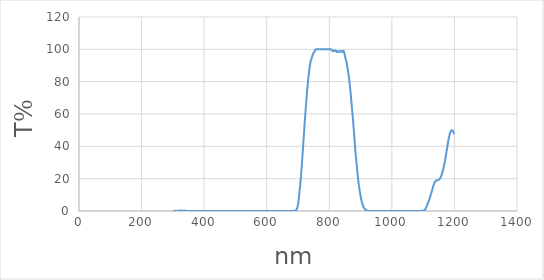
| Category | Series 0 |
|---|---|
| 1200.0 | 47.55 |
| 1199.0 | 47.82 |
| 1198.0 | 48.2 |
| 1197.0 | 48.63 |
| 1196.0 | 49.06 |
| 1195.0 | 49.43 |
| 1194.0 | 49.7 |
| 1193.0 | 49.86 |
| 1192.0 | 49.92 |
| 1191.0 | 49.93 |
| 1190.0 | 49.81 |
| 1189.0 | 49.59 |
| 1188.0 | 49.25 |
| 1187.0 | 48.82 |
| 1186.0 | 48.26 |
| 1185.0 | 47.58 |
| 1184.0 | 46.81 |
| 1183.0 | 45.95 |
| 1182.0 | 45 |
| 1181.0 | 43.97 |
| 1180.0 | 42.9 |
| 1179.0 | 41.79 |
| 1178.0 | 40.65 |
| 1177.0 | 39.48 |
| 1176.0 | 38.31 |
| 1175.0 | 37.14 |
| 1174.0 | 35.96 |
| 1173.0 | 34.79 |
| 1172.0 | 33.62 |
| 1171.0 | 32.47 |
| 1170.0 | 31.35 |
| 1169.0 | 30.29 |
| 1168.0 | 29.29 |
| 1167.0 | 28.34 |
| 1166.0 | 27.46 |
| 1165.0 | 26.62 |
| 1164.0 | 25.83 |
| 1163.0 | 25.06 |
| 1162.0 | 24.32 |
| 1161.0 | 23.62 |
| 1160.0 | 22.96 |
| 1159.0 | 22.35 |
| 1158.0 | 21.8 |
| 1157.0 | 21.32 |
| 1156.0 | 20.9 |
| 1155.0 | 20.54 |
| 1154.0 | 20.23 |
| 1153.0 | 19.96 |
| 1152.0 | 19.73 |
| 1151.0 | 19.53 |
| 1150.0 | 19.37 |
| 1149.0 | 19.24 |
| 1148.0 | 19.14 |
| 1147.0 | 19.07 |
| 1146.0 | 19.01 |
| 1145.0 | 18.97 |
| 1144.0 | 18.94 |
| 1143.0 | 18.9 |
| 1142.0 | 18.84 |
| 1141.0 | 18.74 |
| 1140.0 | 18.58 |
| 1139.0 | 18.36 |
| 1138.0 | 18.08 |
| 1137.0 | 17.73 |
| 1136.0 | 17.3 |
| 1135.0 | 16.82 |
| 1134.0 | 16.28 |
| 1133.0 | 15.7 |
| 1132.0 | 15.08 |
| 1131.0 | 14.41 |
| 1130.0 | 13.74 |
| 1129.0 | 13.07 |
| 1128.0 | 12.4 |
| 1127.0 | 11.74 |
| 1126.0 | 11.08 |
| 1125.0 | 10.44 |
| 1124.0 | 9.82 |
| 1123.0 | 9.19 |
| 1122.0 | 8.57 |
| 1121.0 | 7.95 |
| 1120.0 | 7.33 |
| 1119.0 | 6.74 |
| 1118.0 | 6.19 |
| 1117.0 | 5.65 |
| 1116.0 | 5.15 |
| 1115.0 | 4.66 |
| 1114.0 | 4.18 |
| 1113.0 | 3.69 |
| 1112.0 | 3.21 |
| 1111.0 | 2.75 |
| 1110.0 | 2.31 |
| 1109.0 | 1.91 |
| 1108.0 | 1.54 |
| 1107.0 | 1.23 |
| 1106.0 | 0.95 |
| 1105.0 | 0.72 |
| 1104.0 | 0.55 |
| 1103.0 | 0.41 |
| 1102.0 | 0.3 |
| 1101.0 | 0.23 |
| 1100.0 | 0.18 |
| 1099.0 | 0.16 |
| 1098.0 | 0.12 |
| 1097.0 | 0.11 |
| 1096.0 | 0.09 |
| 1095.0 | 0.08 |
| 1094.0 | 0.07 |
| 1093.0 | 0.06 |
| 1092.0 | 0.06 |
| 1091.0 | 0.05 |
| 1090.0 | 0.05 |
| 1089.0 | 0.04 |
| 1088.0 | 0.04 |
| 1087.0 | 0.02 |
| 1086.0 | 0.01 |
| 1085.0 | 0 |
| 1084.0 | 0.01 |
| 1083.0 | 0.02 |
| 1082.0 | 0.02 |
| 1081.0 | 0.03 |
| 1080.0 | 0.04 |
| 1079.0 | 0.05 |
| 1078.0 | 0.04 |
| 1077.0 | 0.03 |
| 1076.0 | 0.01 |
| 1075.0 | 0 |
| 1074.0 | 0 |
| 1073.0 | 0 |
| 1072.0 | 0 |
| 1071.0 | 0 |
| 1070.0 | 0 |
| 1069.0 | 0 |
| 1068.0 | 0 |
| 1067.0 | 0 |
| 1066.0 | 0.01 |
| 1065.0 | 0.01 |
| 1064.0 | 0 |
| 1063.0 | 0 |
| 1062.0 | 0 |
| 1061.0 | 0.01 |
| 1060.0 | 0.01 |
| 1059.0 | 0.01 |
| 1058.0 | 0.01 |
| 1057.0 | 0.02 |
| 1056.0 | 0.03 |
| 1055.0 | 0.03 |
| 1054.0 | 0.02 |
| 1053.0 | 0 |
| 1052.0 | 0.01 |
| 1051.0 | 0.01 |
| 1050.0 | 0.03 |
| 1049.0 | 0.01 |
| 1048.0 | 0 |
| 1047.0 | 0.02 |
| 1046.0 | 0.03 |
| 1045.0 | 0.04 |
| 1044.0 | 0.03 |
| 1043.0 | 0.02 |
| 1042.0 | 0 |
| 1041.0 | 0.01 |
| 1040.0 | 0.03 |
| 1039.0 | 0.03 |
| 1038.0 | 0.03 |
| 1037.0 | 0.02 |
| 1036.0 | 0.02 |
| 1035.0 | 0 |
| 1034.0 | 0 |
| 1033.0 | 0.01 |
| 1032.0 | 0.01 |
| 1031.0 | 0.02 |
| 1030.0 | 0.01 |
| 1029.0 | 0.01 |
| 1028.0 | 0.01 |
| 1027.0 | 0.01 |
| 1026.0 | 0.02 |
| 1025.0 | 0.03 |
| 1024.0 | 0.03 |
| 1023.0 | 0.03 |
| 1022.0 | 0.03 |
| 1021.0 | 0.02 |
| 1020.0 | 0.01 |
| 1019.0 | 0.01 |
| 1018.0 | 0 |
| 1017.0 | 0 |
| 1016.0 | 0.01 |
| 1015.0 | 0.01 |
| 1014.0 | 0.02 |
| 1013.0 | 0.04 |
| 1012.0 | 0.04 |
| 1011.0 | 0.05 |
| 1010.0 | 0.04 |
| 1009.0 | 0.02 |
| 1008.0 | 0 |
| 1007.0 | 0.01 |
| 1006.0 | 0 |
| 1005.0 | 0.01 |
| 1004.0 | 0.02 |
| 1003.0 | 0.04 |
| 1002.0 | 0.04 |
| 1001.0 | 0.03 |
| 1000.0 | 0.02 |
| 999.0 | 0.01 |
| 998.0 | 0.01 |
| 997.0 | 0 |
| 996.0 | 0.01 |
| 995.0 | 0.01 |
| 994.0 | 0.02 |
| 993.0 | 0.02 |
| 992.0 | 0.03 |
| 991.0 | 0.02 |
| 990.0 | 0.01 |
| 989.0 | 0.01 |
| 988.0 | 0.01 |
| 987.0 | 0 |
| 986.0 | 0 |
| 985.0 | 0 |
| 984.0 | 0 |
| 983.0 | 0.01 |
| 982.0 | 0.02 |
| 981.0 | 0.01 |
| 980.0 | 0.01 |
| 979.0 | 0.01 |
| 978.0 | 0.01 |
| 977.0 | 0 |
| 976.0 | 0.01 |
| 975.0 | 0 |
| 974.0 | 0.01 |
| 973.0 | 0.02 |
| 972.0 | 0.03 |
| 971.0 | 0.03 |
| 970.0 | 0.03 |
| 969.0 | 0.01 |
| 968.0 | 0.01 |
| 967.0 | 0.02 |
| 966.0 | 0.04 |
| 965.0 | 0.03 |
| 964.0 | 0.01 |
| 963.0 | 0 |
| 962.0 | 0.02 |
| 961.0 | 0.04 |
| 960.0 | 0.05 |
| 959.0 | 0.05 |
| 958.0 | 0.04 |
| 957.0 | 0.01 |
| 956.0 | 0.01 |
| 955.0 | 0.02 |
| 954.0 | 0.03 |
| 953.0 | 0.03 |
| 952.0 | 0.04 |
| 951.0 | 0.02 |
| 950.0 | 0.02 |
| 949.0 | 0.03 |
| 948.0 | 0.02 |
| 947.0 | 0.04 |
| 946.0 | 0.02 |
| 945.0 | 0.01 |
| 944.0 | 0.02 |
| 943.0 | 0.04 |
| 942.0 | 0.04 |
| 941.0 | 0.04 |
| 940.0 | 0.05 |
| 939.0 | 0.04 |
| 938.0 | 0.03 |
| 937.0 | 0.01 |
| 936.0 | 0.01 |
| 935.0 | 0 |
| 934.0 | 0.01 |
| 933.0 | 0.04 |
| 932.0 | 0.05 |
| 931.0 | 0.04 |
| 930.0 | 0.03 |
| 929.0 | 0.02 |
| 928.0 | 0.02 |
| 927.0 | 0 |
| 926.0 | 0 |
| 925.0 | 0.02 |
| 924.0 | 0.03 |
| 923.0 | 0.05 |
| 922.0 | 0.11 |
| 921.0 | 0.19 |
| 920.0 | 0.28 |
| 919.0 | 0.35 |
| 918.0 | 0.47 |
| 917.0 | 0.61 |
| 916.0 | 0.78 |
| 915.0 | 0.97 |
| 914.0 | 1.16 |
| 913.0 | 1.43 |
| 912.0 | 1.67 |
| 911.0 | 1.97 |
| 910.0 | 2.26 |
| 909.0 | 2.64 |
| 908.0 | 3.1 |
| 907.0 | 3.64 |
| 906.0 | 4.27 |
| 905.0 | 4.89 |
| 904.0 | 5.6 |
| 903.0 | 6.39 |
| 902.0 | 7.3 |
| 901.0 | 8.26 |
| 900.0 | 9.29 |
| 899.0 | 10.43 |
| 898.0 | 11.59 |
| 897.0 | 12.8 |
| 896.0 | 14.05 |
| 895.0 | 15.34 |
| 894.0 | 16.73 |
| 893.0 | 18.23 |
| 892.0 | 19.93 |
| 891.0 | 21.75 |
| 890.0 | 23.65 |
| 889.0 | 25.61 |
| 888.0 | 27.62 |
| 887.0 | 29.65 |
| 886.0 | 31.67 |
| 885.0 | 33.78 |
| 884.0 | 36.02 |
| 883.0 | 38.33 |
| 882.0 | 40.84 |
| 881.0 | 43.41 |
| 880.0 | 46 |
| 879.0 | 48.6 |
| 878.0 | 51.07 |
| 877.0 | 53.48 |
| 876.0 | 55.77 |
| 875.0 | 58.03 |
| 874.0 | 60.3 |
| 873.0 | 62.55 |
| 872.0 | 64.71 |
| 871.0 | 66.89 |
| 870.0 | 69.01 |
| 869.0 | 71.14 |
| 868.0 | 73.24 |
| 867.0 | 75.24 |
| 866.0 | 77.23 |
| 865.0 | 79.11 |
| 864.0 | 80.84 |
| 863.0 | 82.51 |
| 862.0 | 83.9 |
| 861.0 | 85.25 |
| 860.0 | 86.55 |
| 859.0 | 87.75 |
| 858.0 | 88.93 |
| 857.0 | 90.07 |
| 856.0 | 91.23 |
| 855.0 | 92.11 |
| 854.0 | 92.84 |
| 853.0 | 93.4 |
| 852.0 | 94.27 |
| 851.0 | 95.17 |
| 850.0 | 96.04 |
| 849.0 | 96.93 |
| 848.0 | 97.77 |
| 847.0 | 98.53 |
| 846.0 | 99.01 |
| 845.0 | 99.16 |
| 844.0 | 98.74 |
| 843.0 | 98.33 |
| 842.0 | 98.46 |
| 841.0 | 98.38 |
| 840.0 | 98.57 |
| 839.0 | 98.74 |
| 838.0 | 98.94 |
| 837.0 | 98.95 |
| 836.0 | 98.76 |
| 835.0 | 98.69 |
| 834.0 | 98.57 |
| 833.0 | 98.37 |
| 832.0 | 98.59 |
| 831.0 | 98.81 |
| 830.0 | 98.77 |
| 829.0 | 98.75 |
| 828.0 | 98.69 |
| 827.0 | 98.31 |
| 826.0 | 98.19 |
| 825.0 | 98.47 |
| 824.0 | 98.85 |
| 823.0 | 99 |
| 822.0 | 98.87 |
| 821.0 | 99.04 |
| 820.0 | 99.15 |
| 819.0 | 99.02 |
| 818.0 | 99.23 |
| 817.0 | 99.1 |
| 816.0 | 99.15 |
| 815.0 | 99.28 |
| 814.0 | 99.21 |
| 813.0 | 99.14 |
| 812.0 | 98.84 |
| 811.0 | 98.81 |
| 810.0 | 99.06 |
| 809.0 | 99.32 |
| 808.0 | 99.44 |
| 807.0 | 99.72 |
| 806.0 | 99.93 |
| 805.0 | 99.96 |
| 804.0 | 100 |
| 803.0 | 100 |
| 802.0 | 100 |
| 801.0 | 100 |
| 800.0 | 100 |
| 799.0 | 100 |
| 798.0 | 100 |
| 797.0 | 100 |
| 796.0 | 100 |
| 795.0 | 100 |
| 794.0 | 100 |
| 793.0 | 100 |
| 792.0 | 100 |
| 791.0 | 100 |
| 790.0 | 100 |
| 789.0 | 100 |
| 788.0 | 100 |
| 787.0 | 100 |
| 786.0 | 100 |
| 785.0 | 100 |
| 784.0 | 100 |
| 783.0 | 100 |
| 782.0 | 100 |
| 781.0 | 100 |
| 780.0 | 100 |
| 779.0 | 100 |
| 778.0 | 100 |
| 777.0 | 100 |
| 776.0 | 100 |
| 775.0 | 100 |
| 774.0 | 100 |
| 773.0 | 100 |
| 772.0 | 100 |
| 771.0 | 100 |
| 770.0 | 100 |
| 769.0 | 100 |
| 768.0 | 100 |
| 767.0 | 100 |
| 766.0 | 100 |
| 765.0 | 100 |
| 764.0 | 100 |
| 763.0 | 100 |
| 762.0 | 100 |
| 761.0 | 100 |
| 760.0 | 100 |
| 759.0 | 100 |
| 758.0 | 100 |
| 757.0 | 100 |
| 756.0 | 99.78 |
| 755.0 | 99.46 |
| 754.0 | 99.02 |
| 753.0 | 98.52 |
| 752.0 | 98.36 |
| 751.0 | 98.07 |
| 750.0 | 97.78 |
| 749.0 | 97.65 |
| 748.0 | 97.21 |
| 747.0 | 96.62 |
| 746.0 | 95.99 |
| 745.0 | 95.42 |
| 744.0 | 94.7 |
| 743.0 | 94.08 |
| 742.0 | 93.43 |
| 741.0 | 92.9 |
| 740.0 | 92.07 |
| 739.0 | 90.97 |
| 738.0 | 89.85 |
| 737.0 | 88.58 |
| 736.0 | 87.14 |
| 735.0 | 85.65 |
| 734.0 | 83.96 |
| 733.0 | 82.19 |
| 732.0 | 80.26 |
| 731.0 | 78.32 |
| 730.0 | 76.19 |
| 729.0 | 73.95 |
| 728.0 | 71.63 |
| 727.0 | 69.31 |
| 726.0 | 66.81 |
| 725.0 | 64.26 |
| 724.0 | 61.57 |
| 723.0 | 58.84 |
| 722.0 | 56.07 |
| 721.0 | 53.36 |
| 720.0 | 50.55 |
| 719.0 | 47.72 |
| 718.0 | 44.93 |
| 717.0 | 42.15 |
| 716.0 | 39.3 |
| 715.0 | 36.39 |
| 714.0 | 33.49 |
| 713.0 | 30.6 |
| 712.0 | 27.83 |
| 711.0 | 25.23 |
| 710.0 | 22.74 |
| 709.0 | 20.41 |
| 708.0 | 18.21 |
| 707.0 | 16.15 |
| 706.0 | 14.14 |
| 705.0 | 12.15 |
| 704.0 | 10.27 |
| 703.0 | 8.52 |
| 702.0 | 6.89 |
| 701.0 | 5.42 |
| 700.0 | 4.16 |
| 699.0 | 3.1 |
| 698.0 | 2.27 |
| 697.0 | 1.63 |
| 696.0 | 1.13 |
| 695.0 | 0.8 |
| 694.0 | 0.58 |
| 693.0 | 0.42 |
| 692.0 | 0.32 |
| 691.0 | 0.24 |
| 690.0 | 0.2 |
| 689.0 | 0.15 |
| 688.0 | 0.12 |
| 687.0 | 0.1 |
| 686.0 | 0.08 |
| 685.0 | 0.07 |
| 684.0 | 0.06 |
| 683.0 | 0.05 |
| 682.0 | 0.04 |
| 681.0 | 0.04 |
| 680.0 | 0.03 |
| 679.0 | 0.03 |
| 678.0 | 0.03 |
| 677.0 | 0.03 |
| 676.0 | 0.03 |
| 675.0 | 0.03 |
| 674.0 | 0.03 |
| 673.0 | 0.02 |
| 672.0 | 0.02 |
| 671.0 | 0.02 |
| 670.0 | 0.02 |
| 669.0 | 0.01 |
| 668.0 | 0.01 |
| 667.0 | 0.01 |
| 666.0 | 0.01 |
| 665.0 | 0.02 |
| 664.0 | 0.02 |
| 663.0 | 0.02 |
| 662.0 | 0.02 |
| 661.0 | 0.03 |
| 660.0 | 0.03 |
| 659.0 | 0.03 |
| 658.0 | 0.03 |
| 657.0 | 0.03 |
| 656.0 | 0.03 |
| 655.0 | 0.03 |
| 654.0 | 0.02 |
| 653.0 | 0.02 |
| 652.0 | 0.02 |
| 651.0 | 0.01 |
| 650.0 | 0.01 |
| 649.0 | 0.01 |
| 648.0 | 0.01 |
| 647.0 | 0.01 |
| 646.0 | 0.01 |
| 645.0 | 0.02 |
| 644.0 | 0.02 |
| 643.0 | 0.02 |
| 642.0 | 0.02 |
| 641.0 | 0.02 |
| 640.0 | 0.01 |
| 639.0 | 0.01 |
| 638.0 | 0.01 |
| 637.0 | 0.01 |
| 636.0 | 0.01 |
| 635.0 | 0.01 |
| 634.0 | 0.01 |
| 633.0 | 0.01 |
| 632.0 | 0.01 |
| 631.0 | 0.01 |
| 630.0 | 0.01 |
| 629.0 | 0.01 |
| 628.0 | 0.01 |
| 627.0 | 0.01 |
| 626.0 | 0.01 |
| 625.0 | 0.01 |
| 624.0 | 0.01 |
| 623.0 | 0.01 |
| 622.0 | 0.02 |
| 621.0 | 0.02 |
| 620.0 | 0.01 |
| 619.0 | 0.01 |
| 618.0 | 0.01 |
| 617.0 | 0.01 |
| 616.0 | 0.01 |
| 615.0 | 0.01 |
| 614.0 | 0.01 |
| 613.0 | 0.01 |
| 612.0 | 0.01 |
| 611.0 | 0.02 |
| 610.0 | 0.02 |
| 609.0 | 0.02 |
| 608.0 | 0.02 |
| 607.0 | 0.02 |
| 606.0 | 0.02 |
| 605.0 | 0.02 |
| 604.0 | 0.02 |
| 603.0 | 0.02 |
| 602.0 | 0.02 |
| 601.0 | 0.02 |
| 600.0 | 0.02 |
| 599.0 | 0.01 |
| 598.0 | 0.01 |
| 597.0 | 0.01 |
| 596.0 | 0.01 |
| 595.0 | 0.01 |
| 594.0 | 0.01 |
| 593.0 | 0.01 |
| 592.0 | 0.01 |
| 591.0 | 0.01 |
| 590.0 | 0.01 |
| 589.0 | 0.01 |
| 588.0 | 0.01 |
| 587.0 | 0.01 |
| 586.0 | 0.01 |
| 585.0 | 0.01 |
| 584.0 | 0.01 |
| 583.0 | 0.01 |
| 582.0 | 0.01 |
| 581.0 | 0.01 |
| 580.0 | 0.02 |
| 579.0 | 0.01 |
| 578.0 | 0.01 |
| 577.0 | 0.01 |
| 576.0 | 0.02 |
| 575.0 | 0.02 |
| 574.0 | 0.02 |
| 573.0 | 0.02 |
| 572.0 | 0.02 |
| 571.0 | 0.02 |
| 570.0 | 0.02 |
| 569.0 | 0.01 |
| 568.0 | 0.01 |
| 567.0 | 0.01 |
| 566.0 | 0.01 |
| 565.0 | 0.01 |
| 564.0 | 0.01 |
| 563.0 | 0.01 |
| 562.0 | 0.01 |
| 561.0 | 0.01 |
| 560.0 | 0.01 |
| 559.0 | 0.01 |
| 558.0 | 0.01 |
| 557.0 | 0.01 |
| 556.0 | 0.01 |
| 555.0 | 0.01 |
| 554.0 | 0.01 |
| 553.0 | 0.01 |
| 552.0 | 0.01 |
| 551.0 | 0.01 |
| 550.0 | 0.01 |
| 549.0 | 0.01 |
| 548.0 | 0.01 |
| 547.0 | 0.01 |
| 546.0 | 0.01 |
| 545.0 | 0.01 |
| 544.0 | 0.01 |
| 543.0 | 0.01 |
| 542.0 | 0.01 |
| 541.0 | 0.01 |
| 540.0 | 0.01 |
| 539.0 | 0.01 |
| 538.0 | 0.01 |
| 537.0 | 0.01 |
| 536.0 | 0.01 |
| 535.0 | 0.01 |
| 534.0 | 0.01 |
| 533.0 | 0.01 |
| 532.0 | 0.01 |
| 531.0 | 0.01 |
| 530.0 | 0.02 |
| 529.0 | 0.02 |
| 528.0 | 0.02 |
| 527.0 | 0.02 |
| 526.0 | 0.01 |
| 525.0 | 0.01 |
| 524.0 | 0.01 |
| 523.0 | 0.01 |
| 522.0 | 0.01 |
| 521.0 | 0.02 |
| 520.0 | 0.02 |
| 519.0 | 0.02 |
| 518.0 | 0.02 |
| 517.0 | 0.02 |
| 516.0 | 0.01 |
| 515.0 | 0.01 |
| 514.0 | 0.02 |
| 513.0 | 0.01 |
| 512.0 | 0.01 |
| 511.0 | 0.01 |
| 510.0 | 0.01 |
| 509.0 | 0.01 |
| 508.0 | 0.01 |
| 507.0 | 0.01 |
| 506.0 | 0.01 |
| 505.0 | 0.01 |
| 504.0 | 0.01 |
| 503.0 | 0.01 |
| 502.0 | 0.01 |
| 501.0 | 0.01 |
| 500.0 | 0.01 |
| 499.0 | 0.01 |
| 498.0 | 0.01 |
| 497.0 | 0.01 |
| 496.0 | 0.01 |
| 495.0 | 0.01 |
| 494.0 | 0.01 |
| 493.0 | 0.02 |
| 492.0 | 0.01 |
| 491.0 | 0.01 |
| 490.0 | 0.01 |
| 489.0 | 0.01 |
| 488.0 | 0.01 |
| 487.0 | 0.01 |
| 486.0 | 0.01 |
| 485.0 | 0.01 |
| 484.0 | 0.01 |
| 483.0 | 0.01 |
| 482.0 | 0.01 |
| 481.0 | 0.01 |
| 480.0 | 0.01 |
| 479.0 | 0.01 |
| 478.0 | 0.01 |
| 477.0 | 0.01 |
| 476.0 | 0.02 |
| 475.0 | 0.02 |
| 474.0 | 0.02 |
| 473.0 | 0.02 |
| 472.0 | 0.03 |
| 471.0 | 0.03 |
| 470.0 | 0.03 |
| 469.0 | 0.03 |
| 468.0 | 0.03 |
| 467.0 | 0.03 |
| 466.0 | 0.03 |
| 465.0 | 0.02 |
| 464.0 | 0.02 |
| 463.0 | 0.02 |
| 462.0 | 0.02 |
| 461.0 | 0.02 |
| 460.0 | 0.02 |
| 459.0 | 0.02 |
| 458.0 | 0.01 |
| 457.0 | 0.01 |
| 456.0 | 0.01 |
| 455.0 | 0.02 |
| 454.0 | 0.02 |
| 453.0 | 0.02 |
| 452.0 | 0.02 |
| 451.0 | 0.02 |
| 450.0 | 0.01 |
| 449.0 | 0.01 |
| 448.0 | 0.01 |
| 447.0 | 0 |
| 446.0 | 0 |
| 445.0 | 0.01 |
| 444.0 | 0.01 |
| 443.0 | 0.01 |
| 442.0 | 0.02 |
| 441.0 | 0.02 |
| 440.0 | 0.02 |
| 439.0 | 0.02 |
| 438.0 | 0.02 |
| 437.0 | 0.02 |
| 436.0 | 0.01 |
| 435.0 | 0.01 |
| 434.0 | 0.01 |
| 433.0 | 0.01 |
| 432.0 | 0.01 |
| 431.0 | 0.01 |
| 430.0 | 0.01 |
| 429.0 | 0.01 |
| 428.0 | 0.01 |
| 427.0 | 0 |
| 426.0 | 0 |
| 425.0 | 0.01 |
| 424.0 | 0.01 |
| 423.0 | 0.01 |
| 422.0 | 0.01 |
| 421.0 | 0.01 |
| 420.0 | 0.01 |
| 419.0 | 0.01 |
| 418.0 | 0.01 |
| 417.0 | 0.01 |
| 416.0 | 0.01 |
| 415.0 | 0.01 |
| 414.0 | 0.01 |
| 413.0 | 0.01 |
| 412.0 | 0.02 |
| 411.0 | 0.02 |
| 410.0 | 0.02 |
| 409.0 | 0.02 |
| 408.0 | 0.02 |
| 407.0 | 0.02 |
| 406.0 | 0.03 |
| 405.0 | 0.03 |
| 404.0 | 0.03 |
| 403.0 | 0.04 |
| 402.0 | 0.04 |
| 401.0 | 0.04 |
| 400.0 | 0.03 |
| 399.0 | 0.03 |
| 398.0 | 0.02 |
| 397.0 | 0.01 |
| 396.0 | 0.01 |
| 395.0 | 0.02 |
| 394.0 | 0.02 |
| 393.0 | 0.03 |
| 392.0 | 0.03 |
| 391.0 | 0.04 |
| 390.0 | 0.03 |
| 389.0 | 0.03 |
| 388.0 | 0.02 |
| 387.0 | 0.01 |
| 386.0 | 0.01 |
| 385.0 | 0.02 |
| 384.0 | 0.02 |
| 383.0 | 0.02 |
| 382.0 | 0.02 |
| 381.0 | 0.04 |
| 380.0 | 0.04 |
| 379.0 | 0.04 |
| 378.0 | 0.04 |
| 377.0 | 0.04 |
| 376.0 | 0.04 |
| 375.0 | 0.03 |
| 374.0 | 0.03 |
| 373.0 | 0.04 |
| 372.0 | 0.04 |
| 371.0 | 0.04 |
| 370.0 | 0.04 |
| 369.0 | 0.04 |
| 368.0 | 0.03 |
| 367.0 | 0.03 |
| 366.0 | 0.03 |
| 365.0 | 0.02 |
| 364.0 | 0.01 |
| 363.0 | 0.01 |
| 362.0 | 0.01 |
| 361.0 | 0.02 |
| 360.0 | 0.03 |
| 359.0 | 0.05 |
| 358.0 | 0.05 |
| 357.0 | 0.05 |
| 356.0 | 0.04 |
| 355.0 | 0.03 |
| 354.0 | 0.02 |
| 353.0 | 0.03 |
| 352.0 | 0.03 |
| 351.0 | 0.03 |
| 350.0 | 0.01 |
| 349.0 | 0 |
| 348.0 | 0.03 |
| 347.0 | 0.05 |
| 346.0 | 0.04 |
| 345.0 | 0.02 |
| 344.0 | 0.07 |
| 343.0 | 0.02 |
| 342.0 | 0.06 |
| 341.0 | 0.15 |
| 340.0 | 0.24 |
| 339.0 | 0.28 |
| 338.0 | 0.24 |
| 337.0 | 0.21 |
| 336.0 | 0.11 |
| 335.0 | 0.02 |
| 334.0 | 0.09 |
| 333.0 | 0.25 |
| 332.0 | 0.16 |
| 331.0 | 0.08 |
| 330.0 | 0.09 |
| 329.0 | 0.17 |
| 328.0 | 0.25 |
| 327.0 | 0.24 |
| 326.0 | 0.28 |
| 325.0 | 0.35 |
| 324.0 | 0.3 |
| 323.0 | 0.25 |
| 322.0 | 0.24 |
| 321.0 | 0.19 |
| 320.0 | 0.15 |
| 319.0 | 0.08 |
| 318.0 | 0.17 |
| 317.0 | 0.11 |
| 316.0 | 0.13 |
| 315.0 | 0.04 |
| 314.0 | 0.01 |
| 313.0 | 0.06 |
| 312.0 | 0.08 |
| 311.0 | 0.04 |
| 310.0 | 0.01 |
| 309.0 | 0 |
| 308.0 | 0.03 |
| 307.0 | 0.08 |
| 306.0 | 0.1 |
| 305.0 | 0.09 |
| 304.0 | 0.04 |
| 303.0 | 0.02 |
| 302.0 | 0.02 |
| 301.0 | 0.03 |
| 300.0 | 0.04 |